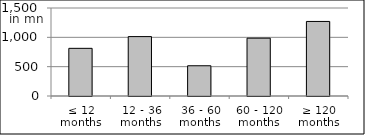
| Category | volume |
|---|---|
| ≤ 12 months | 812386684.98 |
| 12 - 36 months | 1012550379.94 |
| 36 - 60 months | 515507746.35 |
| 60 - 120 months | 985855999.05 |
| ≥ 120 months | 1270764454.626 |